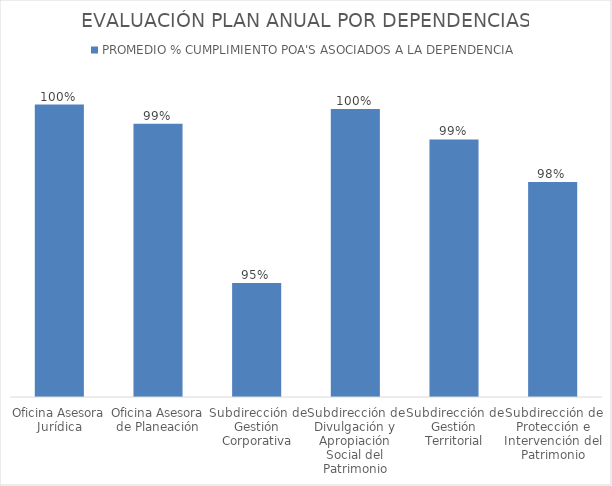
| Category | PROMEDIO % CUMPLIMIENTO POA'S ASOCIADOS A LA DEPENDENCIA |
|---|---|
| Oficina Asesora Jurídica | 1 |
| Oficina Asesora de Planeación | 0.995 |
| Subdirección de Gestión Corporativa | 0.951 |
| Subdirección de Divulgación y Apropiación Social del Patrimonio | 0.999 |
| Subdirección de Gestión Territorial | 0.99 |
| Subdirección de Protección e Intervención del Patrimonio | 0.979 |